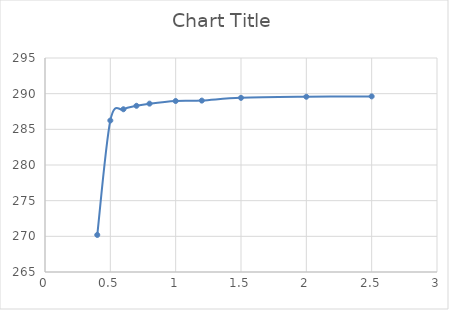
| Category | Series 0 |
|---|---|
| 2.5 | 289.62 |
| 2.0 | 289.568 |
| 1.5 | 289.414 |
| 1.2 | 289.029 |
| 1.0 | 288.97 |
| 0.8 | 288.602 |
| 0.7 | 288.3 |
| 0.6 | 287.814 |
| 0.5 | 286.239 |
| 0.4 | 270.194 |